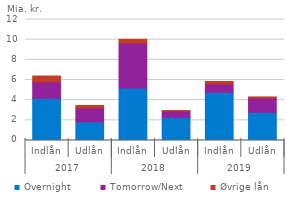
| Category | Overnight | Tomorrow/Next | Øvrige lån |
|---|---|---|---|
| 0 | 4.18 | 1.648 | 0.567 |
| 1 | 1.848 | 1.377 | 0.248 |
| 2 | 5.205 | 4.469 | 0.365 |
| 3 | 2.292 | 0.628 | 0.046 |
| 4 | 4.774 | 0.846 | 0.229 |
| 5 | 2.797 | 1.434 | 0.09 |